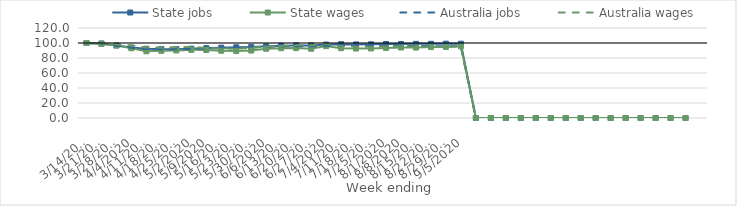
| Category | State jobs | State wages | Australia jobs | Australia wages |
|---|---|---|---|---|
| 14/03/2020 | 100 | 100 | 100 | 100 |
| 21/03/2020 | 99.386 | 98.675 | 99.287 | 99.672 |
| 28/03/2020 | 96.636 | 96.89 | 96.324 | 98.416 |
| 04/04/2020 | 93.979 | 93.048 | 93.668 | 96.718 |
| 11/04/2020 | 92.275 | 88.94 | 91.934 | 94.131 |
| 18/04/2020 | 91.824 | 89.588 | 91.469 | 94.023 |
| 25/04/2020 | 91.82 | 90.024 | 91.796 | 94.249 |
| 02/05/2020 | 92.449 | 90.892 | 92.192 | 94.719 |
| 09/05/2020 | 93.172 | 90.637 | 92.74 | 93.349 |
| 16/05/2020 | 93.801 | 89.666 | 93.27 | 92.686 |
| 23/05/2020 | 94.285 | 89.207 | 93.57 | 92.302 |
| 30/05/2020 | 94.643 | 89.94 | 94.082 | 93.6 |
| 06/06/2020 | 95.63 | 92.304 | 94.995 | 95.373 |
| 13/06/2020 | 96.446 | 93.087 | 95.458 | 96.064 |
| 20/06/2020 | 96.812 | 93.246 | 95.654 | 96.971 |
| 27/06/2020 | 96.695 | 92.35 | 95.59 | 97.092 |
| 04/07/2020 | 97.889 | 95.894 | 96.269 | 98.79 |
| 11/07/2020 | 98.417 | 93.027 | 96.518 | 95.694 |
| 18/07/2020 | 98.121 | 92.614 | 96.375 | 95.102 |
| 25/07/2020 | 98.29 | 92.711 | 96.44 | 94.758 |
| 01/08/2020 | 98.68 | 93.378 | 96.466 | 95.35 |
| 08/08/2020 | 98.677 | 93.98 | 96.196 | 95.604 |
| 15/08/2020 | 98.893 | 93.934 | 96.048 | 95.29 |
| 22/08/2020 | 98.94 | 94.589 | 95.872 | 94.881 |
| 29/08/2020 | 99.106 | 94.845 | 95.598 | 94.692 |
| 05/09/2020 | 99.067 | 95.657 | 95.533 | 95.73 |